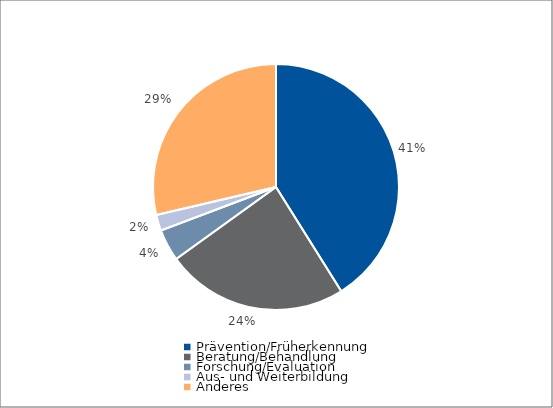
| Category | Series 0 |
|---|---|
| Prävention/Früherkennung | 4800.8 |
| Beratung/Behandlung | 2798.8 |
| Forschung/Evaluation | 490 |
| Aus- und Weiterbildung | 245.7 |
| Anderes | 3347 |